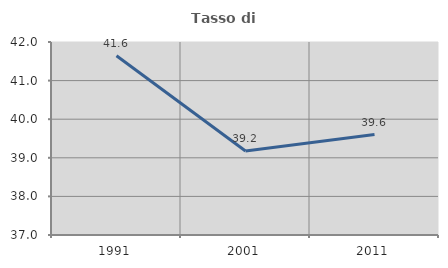
| Category | Tasso di occupazione   |
|---|---|
| 1991.0 | 41.645 |
| 2001.0 | 39.175 |
| 2011.0 | 39.602 |